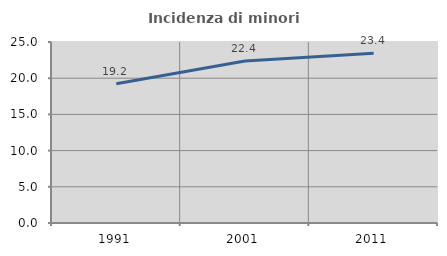
| Category | Incidenza di minori stranieri |
|---|---|
| 1991.0 | 19.231 |
| 2001.0 | 22.388 |
| 2011.0 | 23.449 |